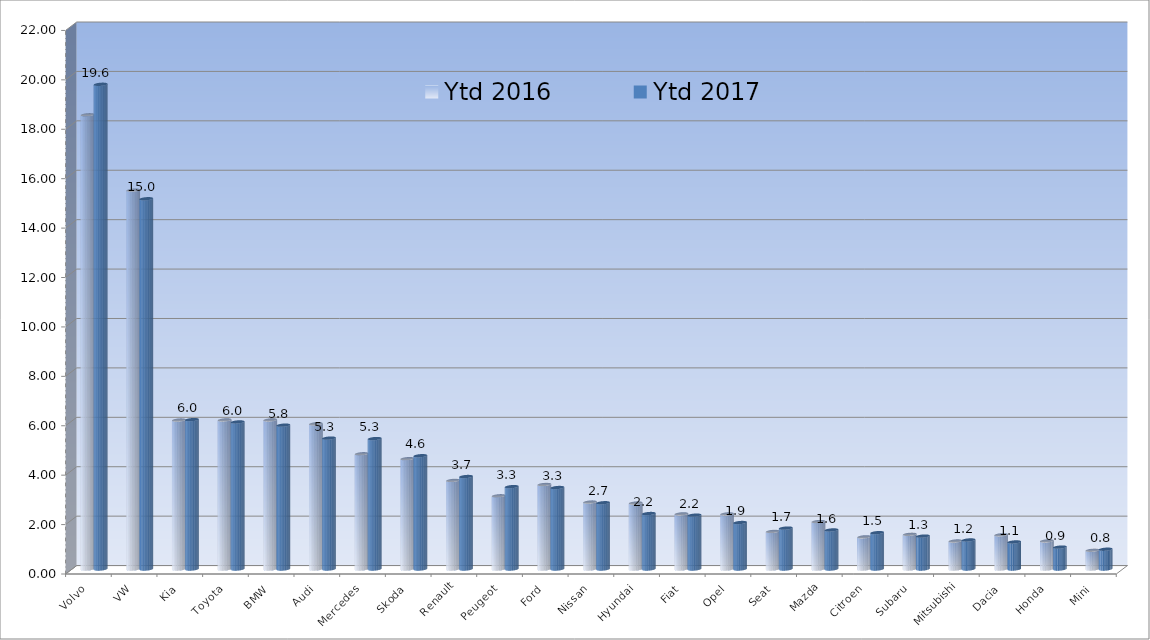
| Category | Ytd 2016 | Ytd 2017 |
|---|---|---|
| Volvo | 18.383 | 19.618 |
| VW | 15.332 | 14.986 |
| Kia | 6.028 | 6.046 |
| Toyota | 6.033 | 5.952 |
| BMW | 6.033 | 5.822 |
| Audi | 5.876 | 5.298 |
| Mercedes | 4.664 | 5.278 |
| Skoda | 4.465 | 4.585 |
| Renault | 3.585 | 3.742 |
| Peugeot | 2.963 | 3.333 |
| Ford | 3.42 | 3.297 |
| Nissan | 2.709 | 2.681 |
| Hyundai | 2.67 | 2.245 |
| Fiat | 2.23 | 2.179 |
| Opel | 2.228 | 1.881 |
| Seat | 1.521 | 1.656 |
| Mazda | 1.92 | 1.58 |
| Citroen | 1.301 | 1.47 |
| Subaru | 1.405 | 1.332 |
| Mitsubishi | 1.133 | 1.175 |
| Dacia | 1.383 | 1.095 |
| Honda | 1.135 | 0.886 |
| Mini | 0.759 | 0.801 |